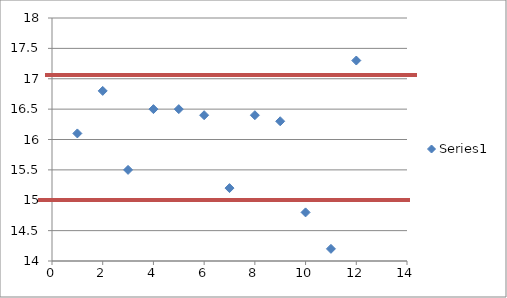
| Category | Series 0 |
|---|---|
| 1.0 | 16.1 |
| 2.0 | 16.8 |
| 3.0 | 15.5 |
| 4.0 | 16.5 |
| 5.0 | 16.5 |
| 6.0 | 16.4 |
| 7.0 | 15.2 |
| 8.0 | 16.4 |
| 9.0 | 16.3 |
| 10.0 | 14.8 |
| 11.0 | 14.2 |
| 12.0 | 17.3 |